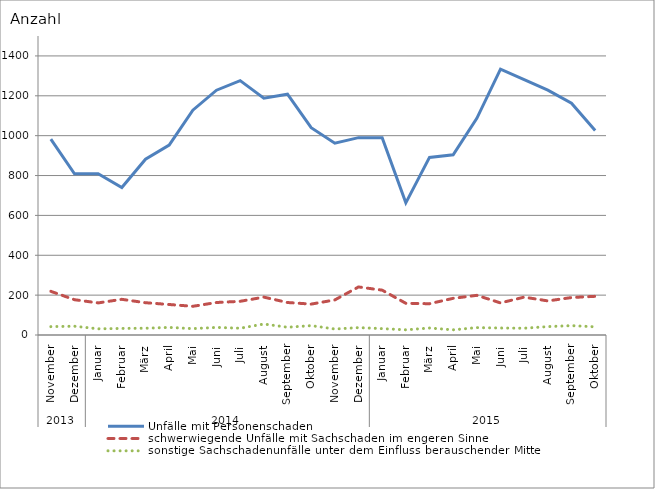
| Category | Unfälle mit Personenschaden | schwerwiegende Unfälle mit Sachschaden im engeren Sinne | sonstige Sachschadenunfälle unter dem Einfluss berauschender Mittel |
|---|---|---|---|
| 0 | 983 | 219 | 42 |
| 1 | 809 | 177 | 44 |
| 2 | 809 | 161 | 31 |
| 3 | 740 | 179 | 33 |
| 4 | 882 | 162 | 34 |
| 5 | 953 | 153 | 38 |
| 6 | 1128 | 144 | 32 |
| 7 | 1228 | 163 | 38 |
| 8 | 1276 | 169 | 34 |
| 9 | 1188 | 190 | 55 |
| 10 | 1208 | 163 | 39 |
| 11 | 1040 | 155 | 47 |
| 12 | 962 | 176 | 30 |
| 13 | 990 | 241 | 37 |
| 14 | 990 | 225 | 32 |
| 15 | 663 | 159 | 26 |
| 16 | 891 | 157 | 35 |
| 17 | 904 | 184 | 26 |
| 18 | 1087 | 199 | 37 |
| 19 | 1334 | 161 | 35 |
| 20 | 1281 | 190 | 34 |
| 21 | 1228 | 171 | 42 |
| 22 | 1163 | 188 | 47 |
| 23 | 1026 | 194 | 41 |